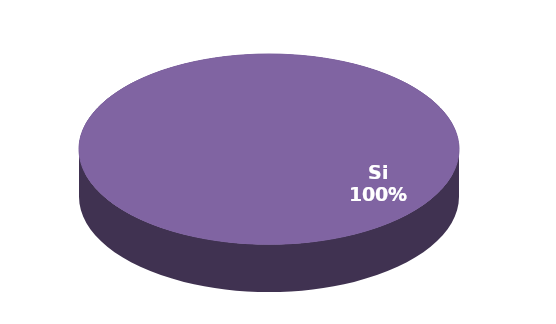
| Category | Series 1 |
|---|---|
| Si | 19 |